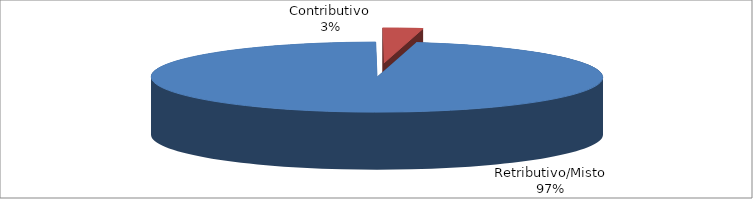
| Category | Decorrenti ANNO 2020 |
|---|---|
| Retributivo/Misto | 85936 |
| Contributivo | 2541 |